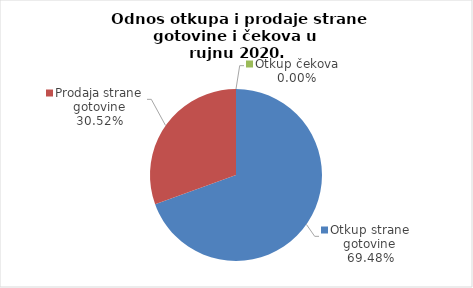
| Category | Series 0 |
|---|---|
| Otkup strane gotovine | 69.477 |
| Prodaja strane gotovine | 30.523 |
| Otkup čekova | 0 |